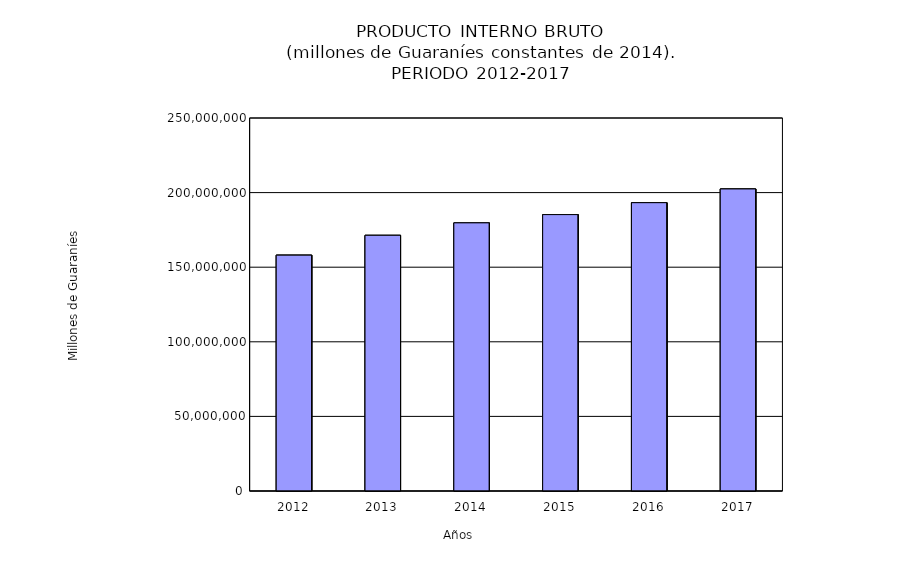
| Category | Series 0 |
|---|---|
| 2012.0 | 158083807.619 |
| 2013.0 | 171390504.671 |
| 2014.0 | 179721609.209 |
| 2015.0 | 185257706.945 |
| 2016.0 | 193247695.796 |
| 2017.0 | 202436970.72 |